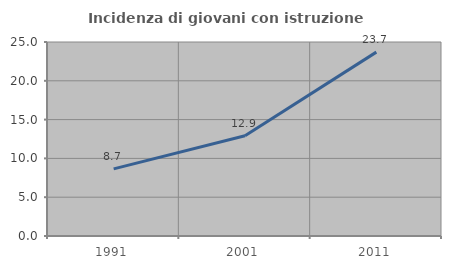
| Category | Incidenza di giovani con istruzione universitaria |
|---|---|
| 1991.0 | 8.654 |
| 2001.0 | 12.919 |
| 2011.0 | 23.697 |